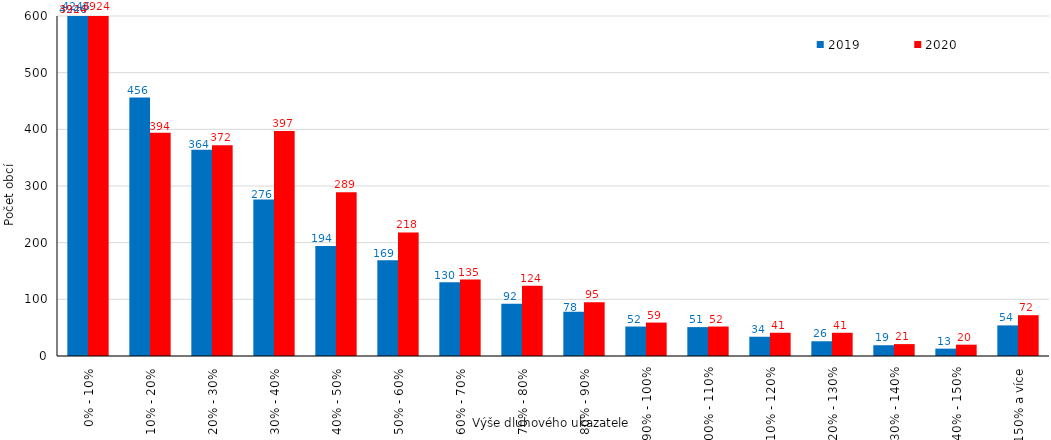
| Category | 2019 | 2020 |
|---|---|---|
| 0% - 10% | 4246 | 3924 |
| 10% - 20% | 456 | 394 |
| 20% - 30% | 364 | 372 |
| 30% - 40% | 276 | 397 |
| 40% - 50% | 194 | 289 |
| 50% - 60% | 169 | 218 |
| 60% - 70% | 130 | 135 |
| 70% - 80% | 92 | 124 |
| 80% - 90% | 78 | 95 |
| 90% - 100% | 52 | 59 |
| 100% - 110% | 51 | 52 |
| 110% - 120% | 34 | 41 |
| 120% - 130% | 26 | 41 |
| 130% - 140% | 19 | 21 |
| 140% - 150% | 13 | 20 |
| 150% a více | 54 | 72 |